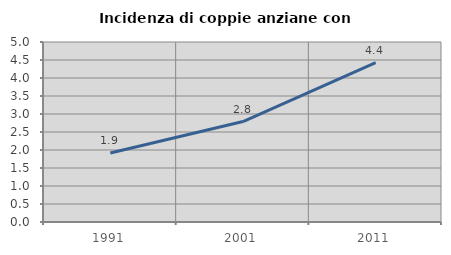
| Category | Incidenza di coppie anziane con figli |
|---|---|
| 1991.0 | 1.917 |
| 2001.0 | 2.791 |
| 2011.0 | 4.43 |